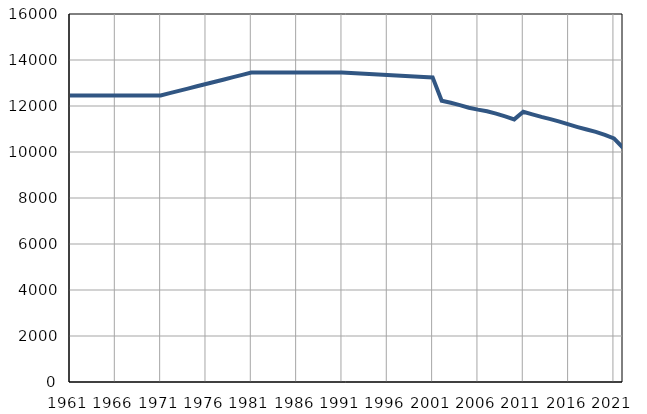
| Category | Број
становника |
|---|---|
| 1961.0 | 12455 |
| 1962.0 | 12455 |
| 1963.0 | 12456 |
| 1964.0 | 12456 |
| 1965.0 | 12457 |
| 1966.0 | 12457 |
| 1967.0 | 12457 |
| 1968.0 | 12458 |
| 1969.0 | 12458 |
| 1970.0 | 12459 |
| 1971.0 | 12459 |
| 1972.0 | 12558 |
| 1973.0 | 12658 |
| 1974.0 | 12757 |
| 1975.0 | 12856 |
| 1976.0 | 12955 |
| 1977.0 | 13055 |
| 1978.0 | 13154 |
| 1979.0 | 13253 |
| 1980.0 | 13353 |
| 1981.0 | 13452 |
| 1982.0 | 13453 |
| 1983.0 | 13453 |
| 1984.0 | 13454 |
| 1985.0 | 13455 |
| 1986.0 | 13455 |
| 1987.0 | 13456 |
| 1988.0 | 13457 |
| 1989.0 | 13458 |
| 1990.0 | 13458 |
| 1991.0 | 13459 |
| 1992.0 | 13438 |
| 1993.0 | 13416 |
| 1994.0 | 13395 |
| 1995.0 | 13373 |
| 1996.0 | 13352 |
| 1997.0 | 13330 |
| 1998.0 | 13309 |
| 1999.0 | 13287 |
| 2000.0 | 13266 |
| 2001.0 | 13244 |
| 2002.0 | 12231 |
| 2003.0 | 12142 |
| 2004.0 | 12038 |
| 2005.0 | 11925 |
| 2006.0 | 11841 |
| 2007.0 | 11771 |
| 2008.0 | 11668 |
| 2009.0 | 11546 |
| 2010.0 | 11418 |
| 2011.0 | 11750 |
| 2012.0 | 11639 |
| 2013.0 | 11525 |
| 2014.0 | 11427 |
| 2015.0 | 11319 |
| 2016.0 | 11200 |
| 2017.0 | 11085 |
| 2018.0 | 10977 |
| 2019.0 | 10878 |
| 2020.0 | 10747 |
| 2021.0 | 10594 |
| 2022.0 | 10184 |